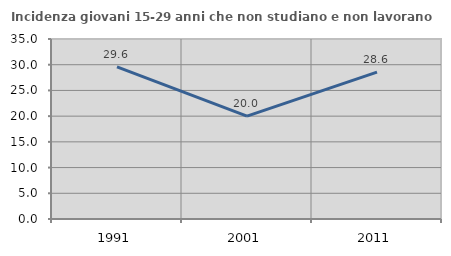
| Category | Incidenza giovani 15-29 anni che non studiano e non lavorano  |
|---|---|
| 1991.0 | 29.586 |
| 2001.0 | 20 |
| 2011.0 | 28.571 |